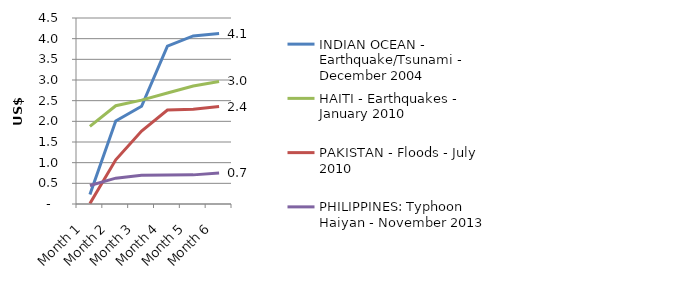
| Category | INDIAN OCEAN - Earthquake/Tsunami - December 2004 | HAITI - Earthquakes - January 2010 | PAKISTAN - Floods - July 2010 | PHILIPPINES: Typhoon Haiyan - November 2013 |
|---|---|---|---|---|
| Month 1 | 0.232 | 1.878 | 0.01 | 0.448 |
| Month 2 | 2.007 | 2.377 | 1.07 | 0.625 |
| Month 3 | 2.365 | 2.513 | 1.764 | 0.695 |
| Month 4 | 3.817 | 2.685 | 2.273 | 0.701 |
| Month 5 | 4.065 | 2.855 | 2.29 | 0.705 |
| Month 6 | 4.123 | 2.966 | 2.357 | 0.75 |